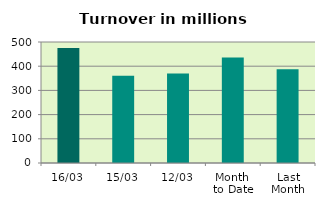
| Category | Series 0 |
|---|---|
| 16/03 | 475.494 |
| 15/03 | 360.803 |
| 12/03 | 369.758 |
| Month 
to Date | 436.276 |
| Last
Month | 387.65 |